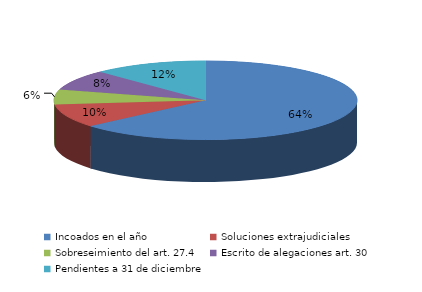
| Category | Series 0 |
|---|---|
| Incoados en el año | 319 |
| Soluciones extrajudiciales | 48 |
| Sobreseimiento del art. 27.4 | 31 |
| Escrito de alegaciones art. 30 | 42 |
| Pendientes a 31 de diciembre | 61 |